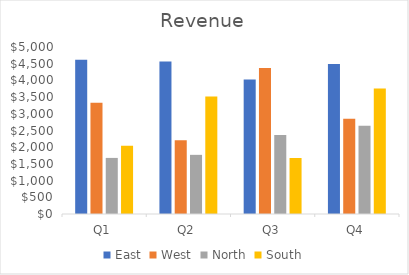
| Category | East | West | North | South |
|---|---|---|---|---|
| Q1 | 4617 | 3334 | 1679 | 2042 |
| Q2 | 4569 | 2211 | 1771 | 3516 |
| Q3 | 4027 | 4370 | 2365 | 1676 |
| Q4 | 4490 | 2854 | 2643 | 3754 |